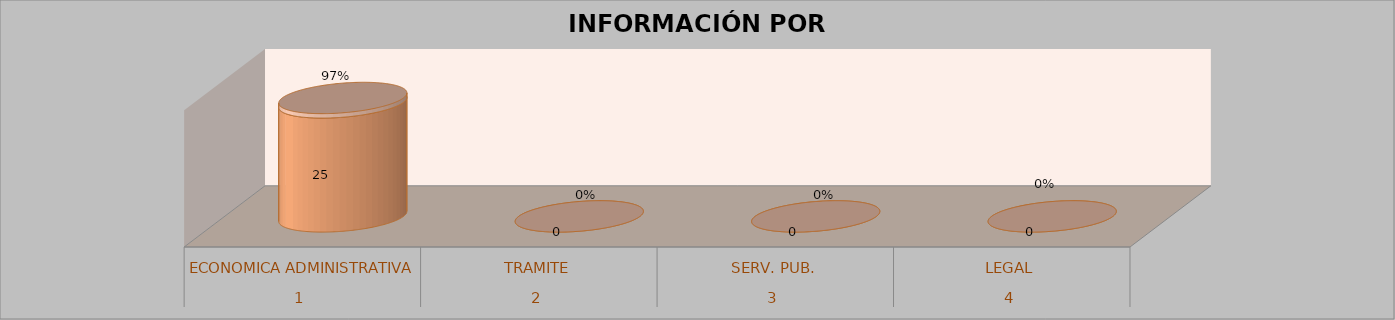
| Category | Series 0 | Series 1 | Series 2 | Series 3 |
|---|---|---|---|---|
| 0 |  |  | 25 | 0.971 |
| 1 |  |  | 0 | 0 |
| 2 |  |  | 0 | 0 |
| 3 |  |  | 0 | 0 |